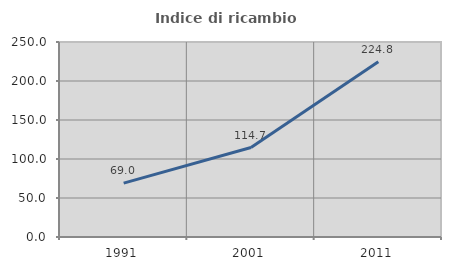
| Category | Indice di ricambio occupazionale  |
|---|---|
| 1991.0 | 69.05 |
| 2001.0 | 114.702 |
| 2011.0 | 224.757 |